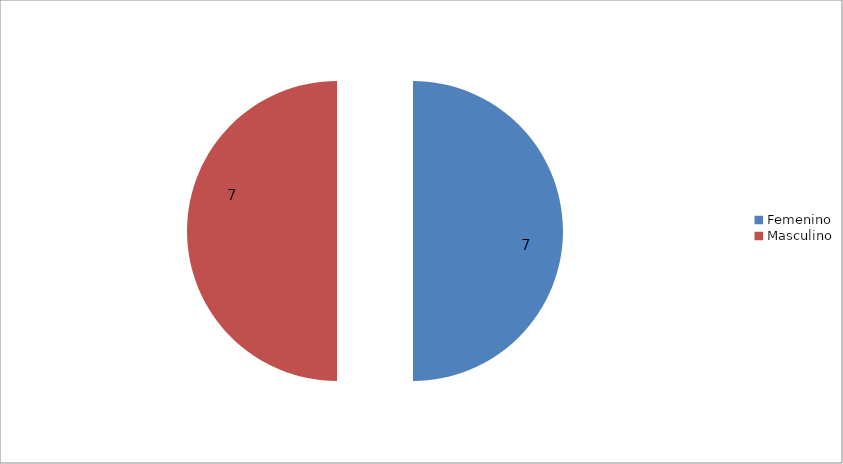
| Category | Series 0 |
|---|---|
| Femenino | 7 |
| Masculino | 7 |